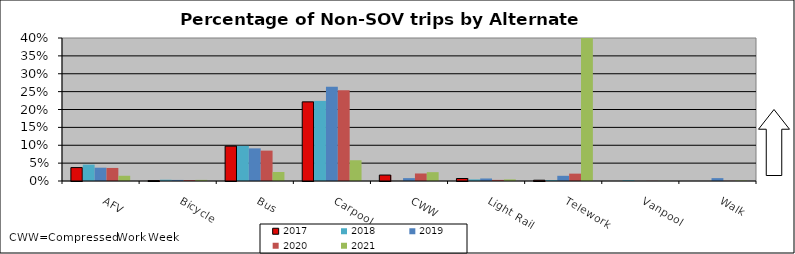
| Category | 2017 | 2018 | 2019 | 2020 | 2021 |
|---|---|---|---|---|---|
| AFV | 0.038 | 0.046 | 0.037 | 0.037 | 0.015 |
| Bicycle | 0.001 | 0.004 | 0.003 | 0.003 | 0.003 |
| Bus | 0.098 | 0.098 | 0.091 | 0.085 | 0.025 |
| Carpool | 0.221 | 0.224 | 0.264 | 0.254 | 0.058 |
| CWW | 0.017 | 0 | 0.008 | 0.021 | 0.025 |
| Light Rail | 0.007 | 0.004 | 0.007 | 0.003 | 0.004 |
| Telework | 0.002 | 0.003 | 0.015 | 0.021 | 0.619 |
| Vanpool | 0 | 0.002 | 0 | 0 | 0 |
| Walk | 0 | 0 | 0.008 | 0 | 0.001 |